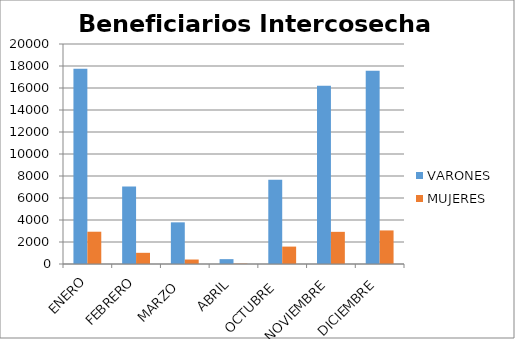
| Category | VARONES  | MUJERES |
|---|---|---|
| ENERO | 17749 | 2935 |
| FEBRERO | 7052 | 1017 |
| MARZO  | 3787 | 407 |
| ABRIL | 441 | 31 |
| OCTUBRE  | 7667 | 1582 |
| NOVIEMBRE | 16205 | 2924 |
| DICIEMBRE | 17563 | 3052 |